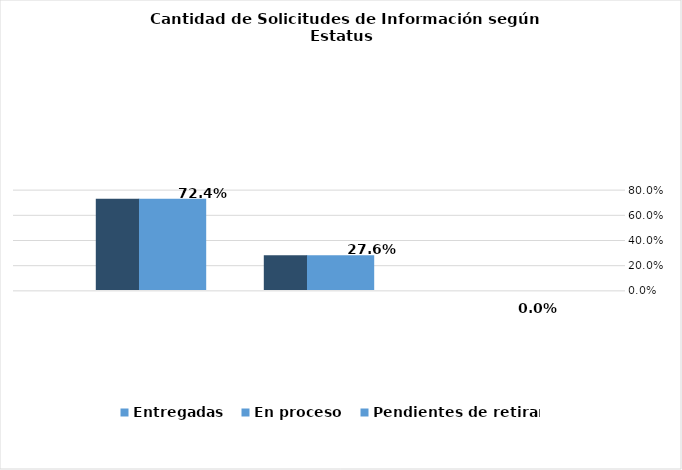
| Category | Entregadas | En proceso | Pendientes de retirar |
|---|---|---|---|
|  | 0.724 | 0.276 | 0 |